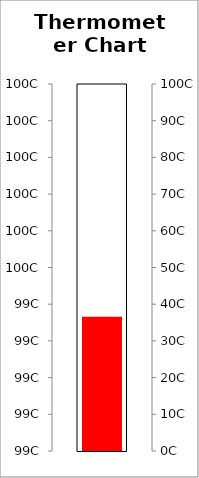
| Category | Maksimum |
|---|---|
| 0 | 100 |